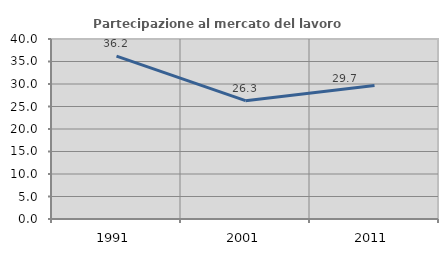
| Category | Partecipazione al mercato del lavoro  femminile |
|---|---|
| 1991.0 | 36.185 |
| 2001.0 | 26.299 |
| 2011.0 | 29.665 |